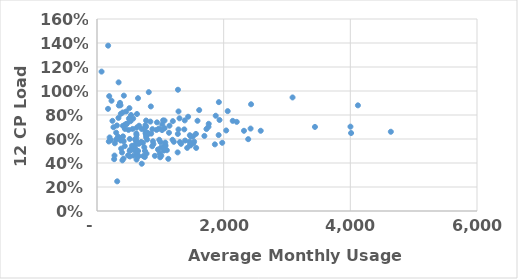
| Category | CP Load Factor |
|---|---|
| 72.07775 | 1.162 |
| 174.24724999999998 | 0.851 |
| 176.01158333333333 | 1.378 |
| 186.28608333333332 | 0.579 |
| 192.70933333333335 | 0.957 |
| 199.58800000000005 | 0.613 |
| 215.07775000000004 | 0.591 |
| 229.26575000000003 | 0.919 |
| 243.87266666666673 | 0.751 |
| 259.6044166666667 | 0.698 |
| 270.7244166666667 | 0.432 |
| 276.42508333333336 | 0.462 |
| 281.6985 | 0.564 |
| 302.3108333333333 | 0.596 |
| 302.6476666666667 | 0.653 |
| 314.1453333333333 | 0.713 |
| 318.9170833333333 | 0.247 |
| 330.96225 | 0.619 |
| 338.6581666666667 | 0.776 |
| 341.3188333333334 | 1.072 |
| 344.4545 | 0.614 |
| 344.4793333333334 | 0.879 |
| 348.80583333333334 | 0.604 |
| 363.51216666666664 | 0.901 |
| 371.1245833333333 | 0.881 |
| 374.9744166666666 | 0.587 |
| 376.05783333333335 | 0.81 |
| 381.1525833333333 | 0.52 |
| 394.40483333333333 | 0.488 |
| 400.847 | 0.422 |
| 406.0924166666667 | 0.821 |
| 408.5405833333334 | 0.71 |
| 410.51483333333334 | 0.622 |
| 418.69624999999996 | 0.437 |
| 421.6280833333333 | 0.581 |
| 424.1658333333333 | 0.961 |
| 438.3941666666667 | 0.541 |
| 441.2228333333334 | 0.684 |
| 444.35941666666673 | 0.721 |
| 460.13100000000003 | 0.829 |
| 463.2179166666667 | 0.724 |
| 473.13100000000003 | 0.728 |
| 490.3989166666667 | 0.464 |
| 497.38483333333335 | 0.676 |
| 503.86516666666654 | 0.771 |
| 511.69658333333336 | 0.857 |
| 516.01 | 0.5 |
| 517.7868333333333 | 0.6 |
| 518.819 | 0.455 |
| 523.6483333333333 | 0.51 |
| 529.9354166666667 | 0.748 |
| 537.6621666666667 | 0.8 |
| 553.0085 | 0.543 |
| 558.8996666666667 | 0.512 |
| 562.03875 | 0.684 |
| 571.5158333333333 | 0.77 |
| 576.8654166666668 | 0.462 |
| 584.8450833333334 | 0.546 |
| 593.8141666666667 | 0.52 |
| 601.1165833333334 | 0.596 |
| 612.2799166666666 | 0.514 |
| 615.78775 | 0.492 |
| 621.0286666666667 | 0.465 |
| 621.0545000000001 | 0.646 |
| 621.3879999999998 | 0.61 |
| 621.606 | 0.571 |
| 623.8858333333334 | 0.634 |
| 624.3855833333333 | 0.558 |
| 624.5188333333334 | 0.428 |
| 624.6443333333333 | 0.583 |
| 626.9955 | 0.695 |
| 630.1385 | 0.571 |
| 631.115 | 0.808 |
| 638.3697500000002 | 0.472 |
| 647.5981666666668 | 0.94 |
| 649.091 | 0.5 |
| 655.7352500000001 | 0.457 |
| 660.34925 | 0.56 |
| 664.2524166666667 | 0.711 |
| 697.6130833333333 | 0.575 |
| 706.8048333333332 | 0.394 |
| 707.5666666666667 | 0.683 |
| 724.8944166666666 | 0.568 |
| 730.1226666666666 | 0.458 |
| 746.3782500000001 | 0.684 |
| 746.5198333333333 | 0.531 |
| 754.1763333333333 | 0.45 |
| 756.4575 | 0.5 |
| 764.9668333333334 | 0.715 |
| 767.2579166666666 | 0.65 |
| 769.8982499999998 | 0.642 |
| 775.013 | 0.703 |
| 775.1974166666665 | 0.754 |
| 775.3913333333331 | 0.63 |
| 775.8855 | 0.614 |
| 779.8781666666665 | 0.655 |
| 782.4989166666666 | 0.479 |
| 790.264 | 0.631 |
| 791.1476666666666 | 0.595 |
| 804.3568333333333 | 0.65 |
| 817.4792499999999 | 0.99 |
| 842.8940833333332 | 0.745 |
| 850.0879166666667 | 0.871 |
| 855.67675 | 0.645 |
| 871.39725 | 0.54 |
| 874.9836666666666 | 0.682 |
| 883.1558333333332 | 0.581 |
| 891.0810833333331 | 0.558 |
| 913.4933333333335 | 0.459 |
| 939.7248333333331 | 0.676 |
| 947.3971666666666 | 0.739 |
| 962.3733333333333 | 0.513 |
| 978.7451666666666 | 0.687 |
| 982.6420833333332 | 0.593 |
| 989.2032499999999 | 0.481 |
| 996.8253333333331 | 0.447 |
| 1003.6031666666668 | 0.573 |
| 1011.5895833333334 | 0.529 |
| 1015.1441666666666 | 0.46 |
| 1027.0051666666666 | 0.674 |
| 1029.9470833333332 | 0.721 |
| 1043.3999166666667 | 0.755 |
| 1051.7378333333334 | 0.503 |
| 1066.4548333333337 | 0.754 |
| 1067.8674166666665 | 0.69 |
| 1069.8473333333332 | 0.538 |
| 1072.6761666666669 | 0.549 |
| 1078.3513333333333 | 0.57 |
| 1082.7529166666668 | 0.545 |
| 1103.2434166666667 | 0.506 |
| 1125.64075 | 0.435 |
| 1136.7823333333333 | 0.652 |
| 1144.2024166666667 | 0.711 |
| 1192.6716666666666 | 0.593 |
| 1197.5502499999998 | 0.749 |
| 1212.8666666666666 | 0.577 |
| 1273.2938333333334 | 0.488 |
| 1276.4530833333333 | 0.642 |
| 1278.3394166666667 | 1.01 |
| 1286.3503333333333 | 0.68 |
| 1287.0416666666667 | 0.83 |
| 1302.3506666666667 | 0.772 |
| 1308.680833333333 | 0.574 |
| 1326.8101666666666 | 0.56 |
| 1378.3130833333335 | 0.68 |
| 1385.3509999999999 | 0.755 |
| 1390.323 | 0.587 |
| 1423.8930833333334 | 0.526 |
| 1438.5597499999997 | 0.785 |
| 1460.3791666666664 | 0.577 |
| 1465.6184166666665 | 0.632 |
| 1469.516666666667 | 0.551 |
| 1477.0664166666666 | 0.547 |
| 1486.7297499999997 | 0.62 |
| 1514.5725000000002 | 0.621 |
| 1521.628833333334 | 0.564 |
| 1533.6136666666669 | 0.578 |
| 1562.1919166666667 | 0.642 |
| 1565.9470833333332 | 0.526 |
| 1586.9378749999998 | 0.752 |
| 1613.7151666666668 | 0.841 |
| 1695.57625 | 0.625 |
| 1728.286 | 0.683 |
| 1760.2490000000005 | 0.702 |
| 1764.1123333333333 | 0.727 |
| 1860.985166666667 | 0.555 |
| 1874.7053333333333 | 0.794 |
| 1920.869583333333 | 0.633 |
| 1924.0535833333333 | 0.907 |
| 1934.6499166666665 | 0.759 |
| 1977.098083333333 | 0.568 |
| 2040.1571666666666 | 0.671 |
| 2063.767416666667 | 0.832 |
| 2143.3311666666664 | 0.751 |
| 2206.5560000000005 | 0.743 |
| 2320.5843750000004 | 0.668 |
| 2387.362666666667 | 0.599 |
| 2425.116 | 0.687 |
| 2432.75625 | 0.889 |
| 2585.2116250000004 | 0.669 |
| 3087.736166666666 | 0.946 |
| 3441.4744166666665 | 0.701 |
| 4002.0060000000008 | 0.703 |
| 4011.884666666667 | 0.65 |
| 4119.904625 | 0.88 |
| 4639.601333333333 | 0.66 |